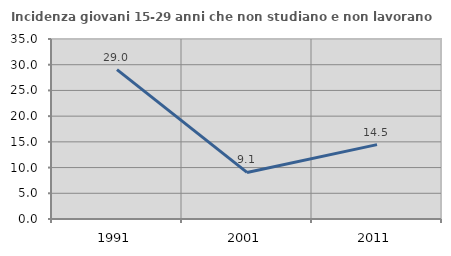
| Category | Incidenza giovani 15-29 anni che non studiano e non lavorano  |
|---|---|
| 1991.0 | 29.032 |
| 2001.0 | 9.058 |
| 2011.0 | 14.468 |